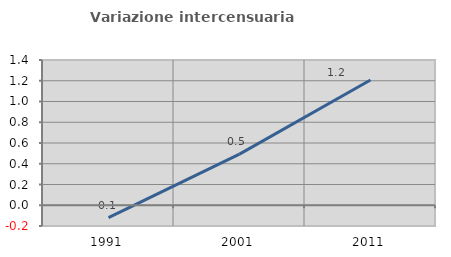
| Category | Variazione intercensuaria annua |
|---|---|
| 1991.0 | -0.118 |
| 2001.0 | 0.492 |
| 2011.0 | 1.207 |